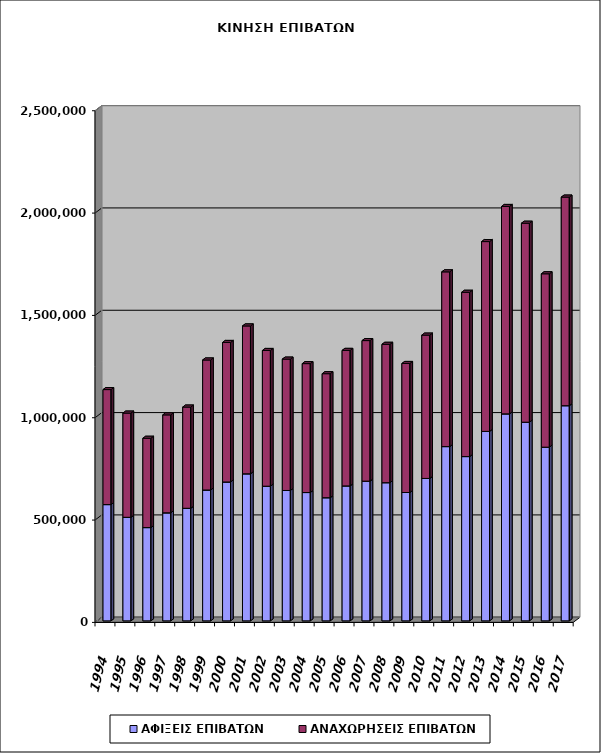
| Category | ΑΦΙΞΕΙΣ ΕΠΙΒΑΤΩΝ | ΑΝΑΧΩΡΗΣΕΙΣ ΕΠΙΒΑΤΩΝ |
|---|---|---|
| 1994.0 | 568140 | 561912 |
| 1995.0 | 505998 | 509150 |
| 1996.0 | 455760 | 436394 |
| 1997.0 | 527897 | 478527 |
| 1998.0 | 550053 | 494551 |
| 1999.0 | 639461 | 635195 |
| 2000.0 | 678663 | 681617 |
| 2001.0 | 718555 | 722431 |
| 2002.0 | 657980 | 663119 |
| 2003.0 | 637073 | 641789 |
| 2004.0 | 627019 | 629922 |
| 2005.0 | 601732 | 605966 |
| 2006.0 | 659545 | 661962 |
| 2007.0 | 682749 | 686661 |
| 2008.0 | 675183 | 675994 |
| 2009.0 | 627120 | 630479 |
| 2010.0 | 695937 | 700246 |
| 2011.0 | 851489 | 853813 |
| 2012.0 | 802760 | 802698 |
| 2013.0 | 925834 | 927362 |
| 2014.0 | 1011367 | 1013347 |
| 2015.0 | 970662 | 972198 |
| 2016.0 | 848682 | 847118 |
| 2017.0 | 1051374 | 1019179 |